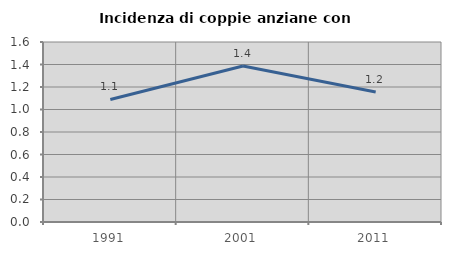
| Category | Incidenza di coppie anziane con figli |
|---|---|
| 1991.0 | 1.089 |
| 2001.0 | 1.386 |
| 2011.0 | 1.156 |